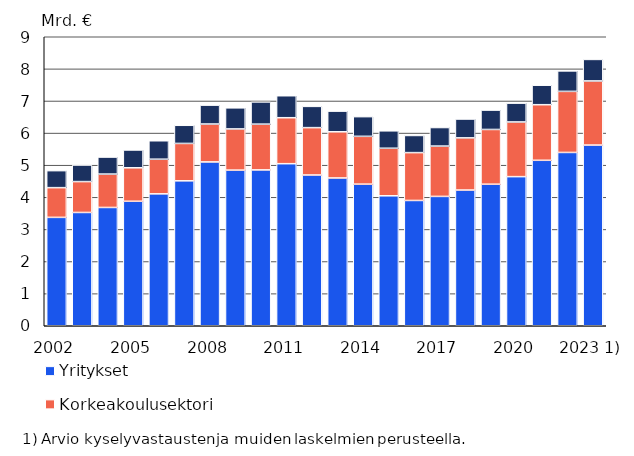
| Category | Yritykset | Korkeakoulusektori | Julkinen sektori ml. yksityinen voittoa tavoittelematon toiminta |
|---|---|---|---|
| 2002 | 3375.1 | 925.6 | 529.7 |
| 2003 | 3527.9 | 961.7 | 515.4 |
| 2004 | 3683.5 | 1039.9 | 530.1 |
| 2005 | 3876.9 | 1042.2 | 554.7 |
| 2006 | 4107.8 | 1079.2 | 574.2 |
| 2007 | 4513.4 | 1164.6 | 564.7 |
| 2008 | 5102 | 1180.6 | 588.5 |
| 2009 | 4847.2 | 1282.8 | 656.5 |
| 2010 | 4854 | 1424.8 | 692 |
| 2011 | 5047 | 1431.8 | 684.4 |
| 2012 | 4695 | 1474.6 | 662.2 |
| 2013 | 4602.4 | 1438.1 | 643.6 |
| 2014 | 4409.5 | 1489.5 | 613.1 |
| 2015 | 4047.3 | 1480.5 | 543.1 |
| 2016 | 3901.7 | 1489.8 | 534.6 |
| 2017 | 4028.4 | 1567.2 | 577.7 |
| 2018 | 4227 | 1624 | 587 |
| 2019 | 4408 | 1705 | 603 |
| 2020 | 4644 | 1703 | 586 |
| 2021 | 5153 | 1731 | 607 |
| 2022 | 5397 | 1902 | 637 |
| 2023 1) | 5627 | 1997 | 670 |